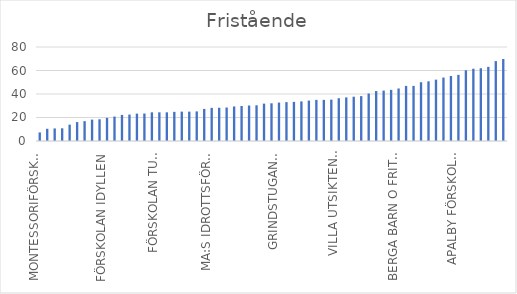
| Category | Series 0 |
|---|---|
| MONTESSORIFÖRSKOLAN BEATA | 7.3 |
| KRISTIANSBORGS FÖRSKOLA | 10.4 |
| STIFTELSEN VÄSTERÅS STENERBARNTRÄDGÅRD | 10.7 |
| BREVDUVANS FÖRSKOLA | 10.8 |
| FÖRSKOLAN ÅKESTA | 13.9 |
| PILTRÄDETS FÖRSKOLA | 16.1 |
| KOLIBRI AB | 16.9 |
| MUSIKFÖRSKOLAN ÅLLE-BÅLLE | 18.2 |
| FÖRSKOLAN IDYLLEN | 18.5 |
| VILLA KOLIBRI | 19.7 |
| NORLANDIA FÖRSKOLOR NYGÅRDS | 20.8 |
| FÖRSKOLAN MARIPOSA AB | 22.2 |
| FSK TUMMELISA | 22.5 |
| HAGVIDSON NASSE | 23.3 |
| FÖRSKOLAN OASEN | 23.4 |
| FÖRSKOLAN EMILIA TRE | 24.4 |
| FÖRSKOLAN TUSENFOTINGEN | 24.4 |
| I UR OCH SKUR FÖRSKOLAN BOKEN | 24.4 |
| FÖRSKOLAN BUSBOLAGET AB | 24.8 |
| FÖRSKOLAN VÄSTANVINDEN | 25 |
| VÄSTERÅS INTERNATIONELLA SKOLA & FÖRSKOLA | 25 |
| HAGVIDSON EKOT AB | 25.2 |
| FÖRSKOLAN TUULAS TROLL AB | 27.3 |
| FÖRÄLDRARKOOPERATIVET RUSSET EK. FÖR | 28.2 |
| MA:S IDROTTSFÖRSKOLA PIGGELIN | 28.3 |
| STELLA BAMBINO | 28.5 |
| FÖRSKOLAN PÄRLAN | 29.4 |
| TILLBERGA GRANNSKAPSSERVICE FÖRSKOLA | 29.8 |
| FÖRÄLDRAKOOPERATIVET SALTKRÅKAN | 30.2 |
| IQRA VÄST | 30.4 |
| NORLANDIA FÖRSKOLOR LÖVUDDEN | 31.8 |
| NORLANDIA FÖRSKOLOR INSPIRATÖREN | 32.1 |
| GRINDSTUGANS FÖRSKOLA | 32.7 |
| NORLANDIA FÖRSKOLOR ÖRTAGÅRDEN | 33.1 |
| LILLA ACADEMIA HAGA | 33.3 |
| MA:S IDROTTSFÖRSKOLA MINIHOPP | 33.7 |
| FÖRSKOLAN BUSVISSLAN | 34.4 |
| FÖRSKOLAN EMILIA ÖST | 35 |
| FÖRSKOLAN IQRA | 35 |
| BYSTUGANS FÖRSKOLA AB | 35.2 |
| VILLA UTSIKTENS FÖRSKOLA | 36.4 |
| LILLA ÄVENTYRET | 37.1 |
| IRSTA VÄSTERÄNGEN NATURFÖRSKOLA | 37.7 |
| FÖRSKOLAN SKATTKISTAN | 38.2 |
| SKÄLBYSKOLANS FÖRSKOLA | 40.4 |
| SOLGÅRDEN MONTESSORI FSK | 42.5 |
| LILLA ACADEMIA TRÄDKRONAN | 42.9 |
| FÖRSKOLAN ZODIAKEN | 43.5 |
| BERGA BARN O FRITID EK. FÖRENING | 44.7 |
| FJÄLL Å BERG AB | 46.9 |
| JENSEN FÖRSKOLA TILLBERGA | 46.9 |
| FÖRSKOLAN MONALISA AB | 50 |
| FÖRSKOLAN BÄRET | 50.8 |
| HÖVDINGENS FÖRSKOLA | 52.2 |
| POMPERIPOSSA | 54 |
| HAGABERGS FÖRSKOLA | 55.3 |
| APALBY FÖRSKOLA AB | 56.3 |
| DJÄKNEBERGETS FÖRÄLDARKOOPERATIV | 60.2 |
| KOOPERATIVET HJÄRTPUNKT SKILJEBO | 61.5 |
| FÖRSKOLAN HAGATROLLET | 61.9 |
| SKATTGÖMMAN | 63.1 |
| FÖRSKOLAN GUNGHÄSTEN | 68 |
| TROLLHATTENS FÖRSKOLA | 69.8 |